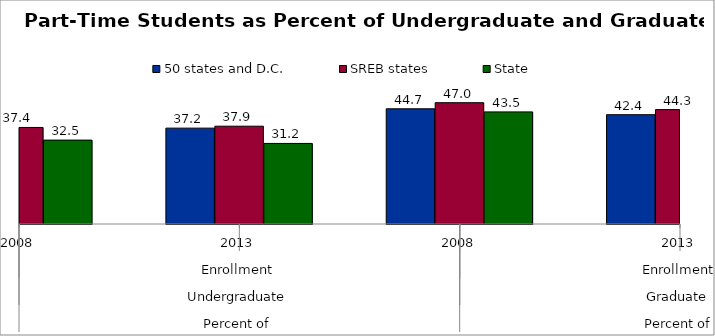
| Category | 50 states and D.C. | SREB states | State |
|---|---|---|---|
| 0 | 37.374 | 37.419 | 32.514 |
| 1 | 37.159 | 37.907 | 31.226 |
| 2 | 44.658 | 47.02 | 43.45 |
| 3 | 42.372 | 44.345 | 39.298 |